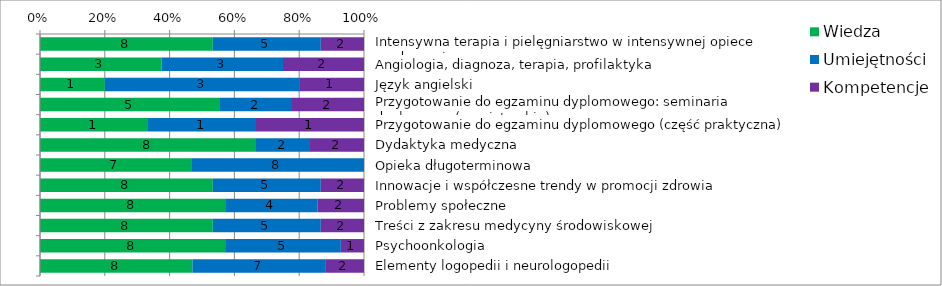
| Category | Wiedza | Umiejętności | Kompetencje |
|---|---|---|---|
| Intensywna terapia i pielęgniarstwo w intensywnej opiece medycznej | 8 | 5 | 2 |
| Angiologia, diagnoza, terapia, profilaktyka | 3 | 3 | 2 |
| Język angielski | 1 | 3 | 1 |
| Przygotowanie do egzaminu dyplomowego: seminaria dyplomowe (magisterskie) | 5 | 2 | 2 |
| Przygotowanie do egzaminu dyplomowego (część praktyczna) | 1 | 1 | 1 |
| Dydaktyka medyczna | 8 | 2 | 2 |
| Opieka długoterminowa | 7 | 8 | 0 |
| Innowacje i współczesne trendy w promocji zdrowia | 8 | 5 | 2 |
| Problemy społeczne | 8 | 4 | 2 |
| Treści z zakresu medycyny środowiskowej | 8 | 5 | 2 |
| Psychoonkologia | 8 | 5 | 1 |
| Elementy logopedii i neurologopedii | 8 | 7 | 2 |